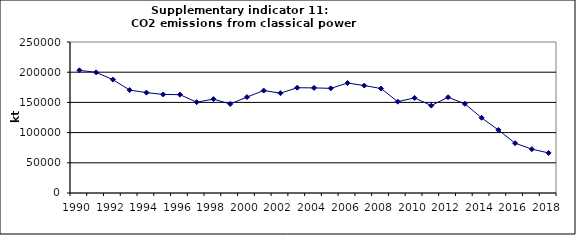
| Category | CO2 emissions from classical power production, kt |
|---|---|
| 1990 | 203115.85 |
| 1991 | 199721.534 |
| 1992 | 187719.121 |
| 1993 | 170385.131 |
| 1994 | 166212.714 |
| 1995 | 163159.198 |
| 1996 | 162836.608 |
| 1997 | 150330.59 |
| 1998 | 155430.957 |
| 1999 | 147398.525 |
| 2000 | 158824.197 |
| 2001 | 169590.288 |
| 2002 | 165293.373 |
| 2003 | 174329.252 |
| 2004 | 174003.716 |
| 2005 | 173265.789 |
| 2006 | 182074.674 |
| 2007 | 177931.929 |
| 2008 | 172931.354 |
| 2009 | 151214.508 |
| 2010 | 157453.812 |
| 2011 | 144737.876 |
| 2012 | 158558.606 |
| 2013 | 147644.138 |
| 2014 | 124512.655 |
| 2015 | 104335.573 |
| 2016 | 82489.225 |
| 2017 | 72594.537 |
| 2018 | 66308.027 |